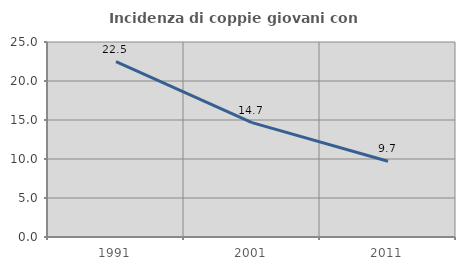
| Category | Incidenza di coppie giovani con figli |
|---|---|
| 1991.0 | 22.497 |
| 2001.0 | 14.667 |
| 2011.0 | 9.707 |